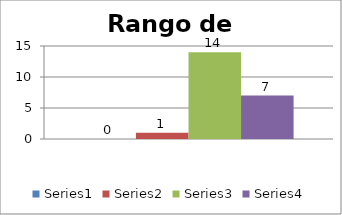
| Category | Series 0 | Series 1 | Series 2 | Series 3 |
|---|---|---|---|---|
| 0 | 0 | 1 | 14 | 7 |